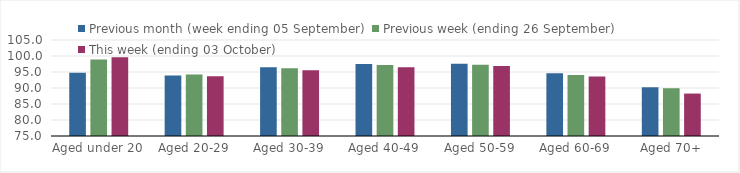
| Category | Previous month (week ending 05 September) | Previous week (ending 26 September) | This week (ending 03 October) |
|---|---|---|---|
| Aged under 20 | 94.74 | 98.92 | 99.62 |
| Aged 20-29 | 93.93 | 94.19 | 93.64 |
| Aged 30-39 | 96.46 | 96.21 | 95.51 |
| Aged 40-49 | 97.47 | 97.17 | 96.51 |
| Aged 50-59 | 97.6 | 97.29 | 96.84 |
| Aged 60-69 | 94.58 | 94.09 | 93.57 |
| Aged 70+ | 90.23 | 89.93 | 88.26 |